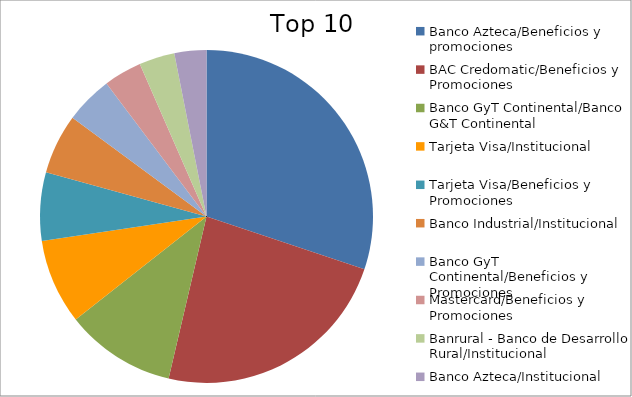
| Category | Series 0 |
|---|---|
| Banco Azteca/Beneficios y promociones | 26.42 |
| BAC Credomatic/Beneficios y Promociones | 20.61 |
| Banco GyT Continental/Banco G&T Continental | 9.4 |
| Tarjeta Visa/Institucional | 7.24 |
| Tarjeta Visa/Beneficios y Promociones | 5.82 |
| Banco Industrial/Institucional | 5.11 |
| Banco GyT Continental/Beneficios y Promociones | 4.06 |
| Mastercard/Beneficios y Promociones | 3.24 |
| Banrural - Banco de Desarrollo Rural/Institucional | 3.03 |
| Banco Azteca/Institucional | 2.72 |